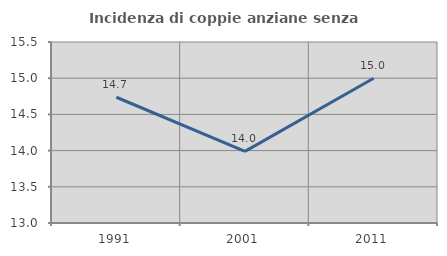
| Category | Incidenza di coppie anziane senza figli  |
|---|---|
| 1991.0 | 14.737 |
| 2001.0 | 13.99 |
| 2011.0 | 15 |